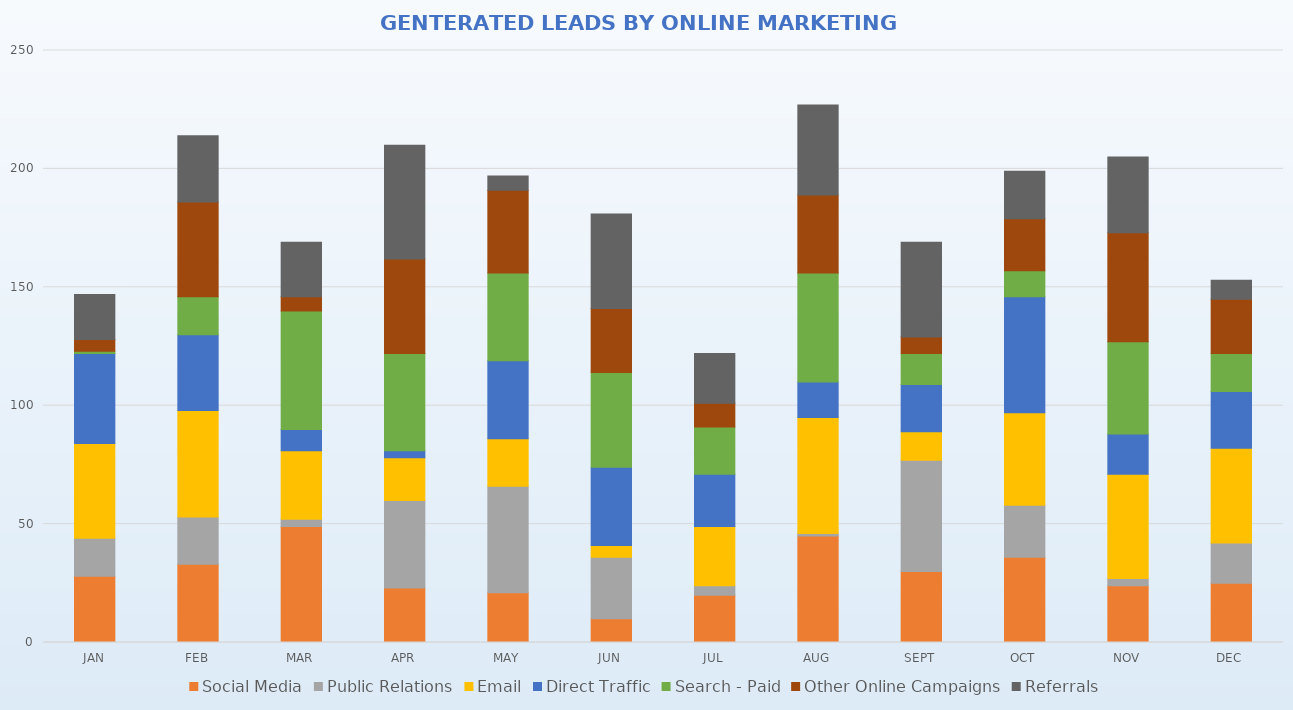
| Category | Social Media | Public Relations | Email | Direct Traffic | Search - Paid | Other Online Campaigns | Referrals |
|---|---|---|---|---|---|---|---|
| JAN | 28 | 16 | 40 | 38 | 1 | 5 | 19 |
| FEB | 33 | 20 | 45 | 32 | 16 | 40 | 28 |
| MAR | 49 | 3 | 29 | 9 | 50 | 6 | 23 |
| APR | 23 | 37 | 18 | 3 | 41 | 40 | 48 |
| MAY | 21 | 45 | 20 | 33 | 37 | 35 | 6 |
| JUN | 10 | 26 | 5 | 33 | 40 | 27 | 40 |
| JUL | 20 | 4 | 25 | 22 | 20 | 10 | 21 |
| AUG | 45 | 1 | 49 | 15 | 46 | 33 | 38 |
| SEPT | 30 | 47 | 12 | 20 | 13 | 7 | 40 |
| OCT | 36 | 22 | 39 | 49 | 11 | 22 | 20 |
| NOV | 24 | 3 | 44 | 17 | 39 | 46 | 32 |
| DEC | 25 | 17 | 40 | 24 | 16 | 23 | 8 |